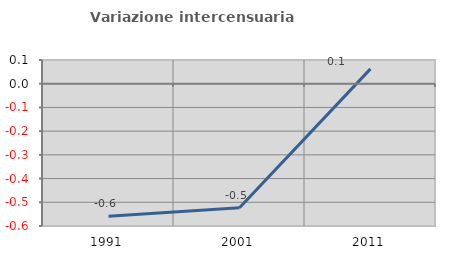
| Category | Variazione intercensuaria annua |
|---|---|
| 1991.0 | -0.559 |
| 2001.0 | -0.523 |
| 2011.0 | 0.062 |